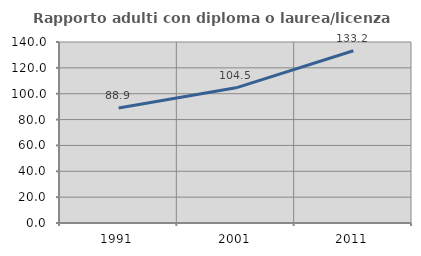
| Category | Rapporto adulti con diploma o laurea/licenza media  |
|---|---|
| 1991.0 | 88.889 |
| 2001.0 | 104.539 |
| 2011.0 | 133.214 |